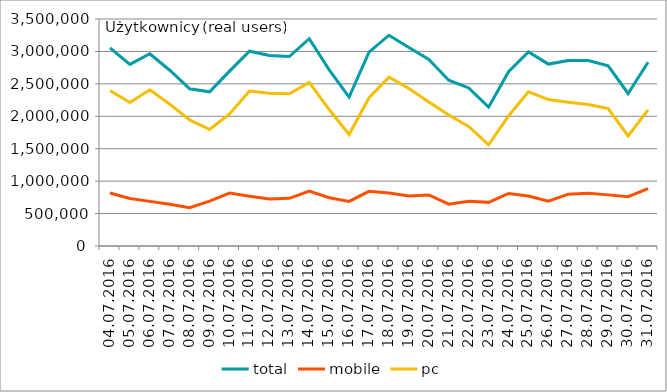
| Category | total | mobile | pc |
|---|---|---|---|
| 04.07.2016 | 3054210 | 817080 | 2396477 |
| 05.07.2016 | 2800882 | 731664 | 2213421 |
| 06.07.2016 | 2964196 | 688196 | 2407531 |
| 07.07.2016 | 2710038 | 645158 | 2186455 |
| 08.07.2016 | 2424446 | 589693 | 1944516 |
| 09.07.2016 | 2376660 | 691964 | 1796557 |
| 10.07.2016 | 2696459 | 815696 | 2037124 |
| 11.07.2016 | 3003504 | 768289 | 2390108 |
| 12.07.2016 | 2938845 | 725856 | 2355929 |
| 13.07.2016 | 2921718 | 735623 | 2347059 |
| 14.07.2016 | 3195959 | 848330 | 2523140 |
| 15.07.2016 | 2716702 | 743850 | 2103865 |
| 16.07.2016 | 2295976 | 686930 | 1720240 |
| 17.07.2016 | 2988243 | 843396 | 2285879 |
| 18.07.2016 | 3249753 | 816324 | 2601965 |
| 19.07.2016 | 3061122 | 772359 | 2428820 |
| 20.07.2016 | 2875722 | 787464 | 2220026 |
| 21.07.2016 | 2555605 | 644237 | 2018812 |
| 22.07.2016 | 2436756 | 688547 | 1843455 |
| 23.07.2016 | 2141032 | 672755 | 1559735 |
| 24.07.2016 | 2686973 | 810273 | 2006245 |
| 25.07.2016 | 2993227 | 771780 | 2376799 |
| 26.07.2016 | 2804847 | 690757 | 2257119 |
| 27.07.2016 | 2861648 | 799478 | 2215851 |
| 28.07.2016 | 2858922 | 812104 | 2181122 |
| 29.07.2016 | 2779051 | 788288 | 2119635 |
| 30.07.2016 | 2351574 | 759835 | 1697697 |
| 31.07.2016 | 2833949 | 883232 | 2098430 |